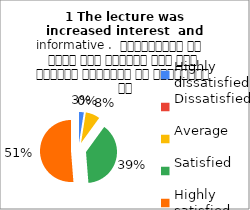
| Category | 1 The lecture was
increased interest  and informative .  व्याख्यान से रुचि में वृद्धि हुई एवं शिक्षण जानकारी से परिपूर्ण था |
|---|---|
| Highly dissatisfied | 2 |
| Dissatisfied | 0 |
| Average | 6 |
| Satisfied | 31 |
| Highly satisfied | 41 |